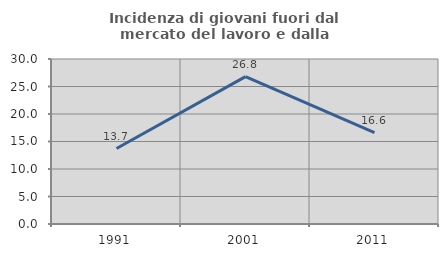
| Category | Incidenza di giovani fuori dal mercato del lavoro e dalla formazione  |
|---|---|
| 1991.0 | 13.72 |
| 2001.0 | 26.797 |
| 2011.0 | 16.605 |